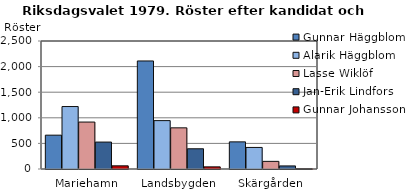
| Category | Gunnar Häggblom | Alarik Häggblom | Lasse Wiklöf | Jan-Erik Lindfors | Gunnar Johansson |
|---|---|---|---|---|---|
| Mariehamn | 661 | 1220 | 917 | 526 | 62 |
| Landsbygden | 2110 | 945 | 804 | 395 | 42 |
| Skärgården | 530 | 421 | 149 | 60 | 7 |